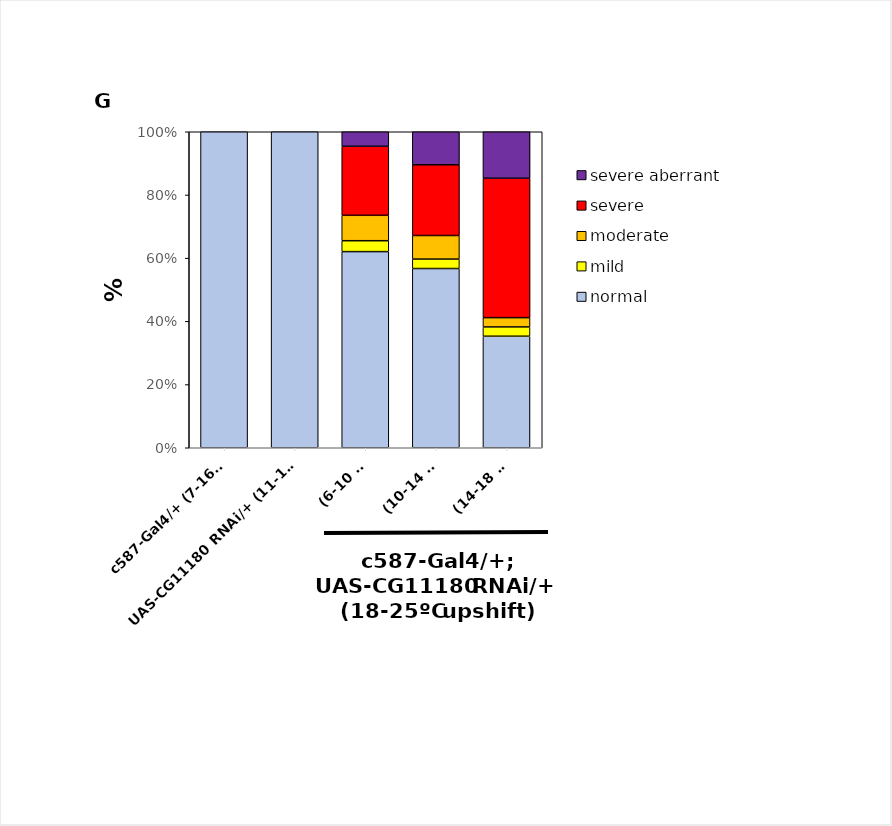
| Category | normal | mild | moderate | severe | severe aberrant |
|---|---|---|---|---|---|
| c587-Gal4/+ (7-16 d) | 56 | 0 | 0 | 0 | 0 |
| UAS-CG11180 RNAi/+ (11-14 d) | 11 | 0 | 0 | 0 | 0 |
| (6-10 d) | 54 | 3 | 7 | 19 | 4 |
| (10-14 d) | 38 | 2 | 5 | 15 | 7 |
| (14-18 d) | 12 | 1 | 1 | 15 | 5 |